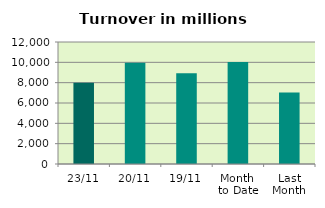
| Category | Series 0 |
|---|---|
| 23/11 | 7984.221 |
| 20/11 | 9971.274 |
| 19/11 | 8934.761 |
| Month 
to Date | 10030.152 |
| Last
Month | 7023.861 |